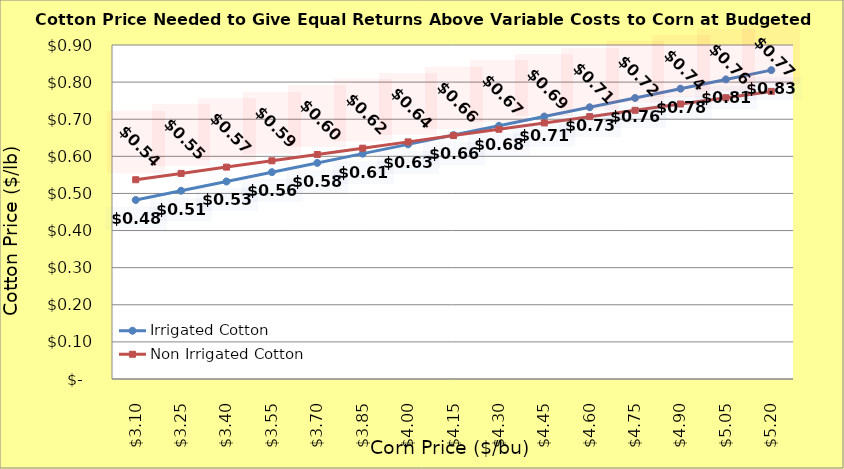
| Category | Irrigated Cotton | Non Irrigated Cotton |
|---|---|---|
| 3.1000000000000005 | 0.482 | 0.537 |
| 3.2500000000000004 | 0.507 | 0.554 |
| 3.4000000000000004 | 0.532 | 0.571 |
| 3.5500000000000003 | 0.557 | 0.588 |
| 3.7 | 0.582 | 0.605 |
| 3.85 | 0.607 | 0.622 |
| 4.0 | 0.632 | 0.639 |
| 4.15 | 0.657 | 0.656 |
| 4.300000000000001 | 0.682 | 0.673 |
| 4.450000000000001 | 0.707 | 0.69 |
| 4.600000000000001 | 0.732 | 0.707 |
| 4.750000000000002 | 0.757 | 0.724 |
| 4.900000000000002 | 0.782 | 0.741 |
| 5.0500000000000025 | 0.807 | 0.758 |
| 5.200000000000003 | 0.832 | 0.775 |